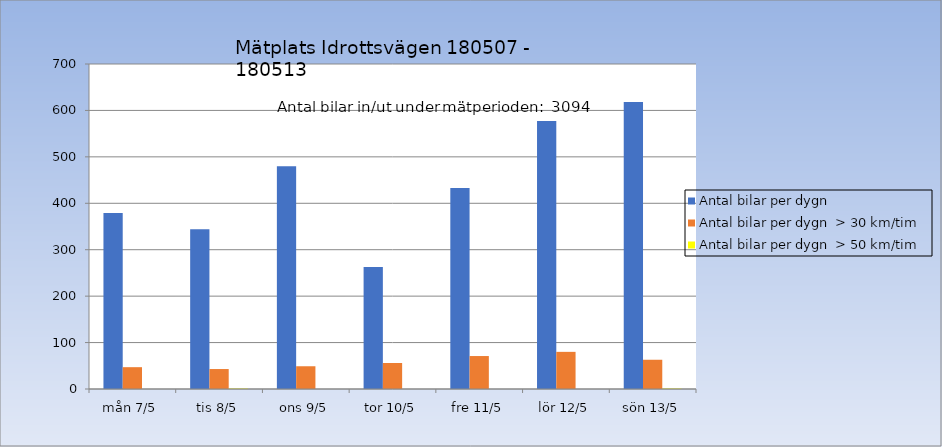
| Category | Antal bilar per dygn | Antal bilar per dygn  > 30 km/tim | Antal bilar per dygn  > 50 km/tim |
|---|---|---|---|
| mån 7/5 | 379 | 47 | 0 |
| tis 8/5 | 344 | 43 | 1 |
| ons 9/5 | 480 | 49 | 0 |
| tor 10/5 | 263 | 56 | 0 |
| fre 11/5 | 433 | 71 | 0 |
| lör 12/5 | 577 | 80 | 0 |
| sön 13/5 | 618 | 63 | 1 |